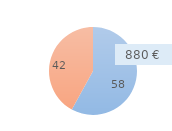
| Category | Series 0 |
|---|---|
| 0 | 58 |
| 1 | 42 |
| 2 | 0 |